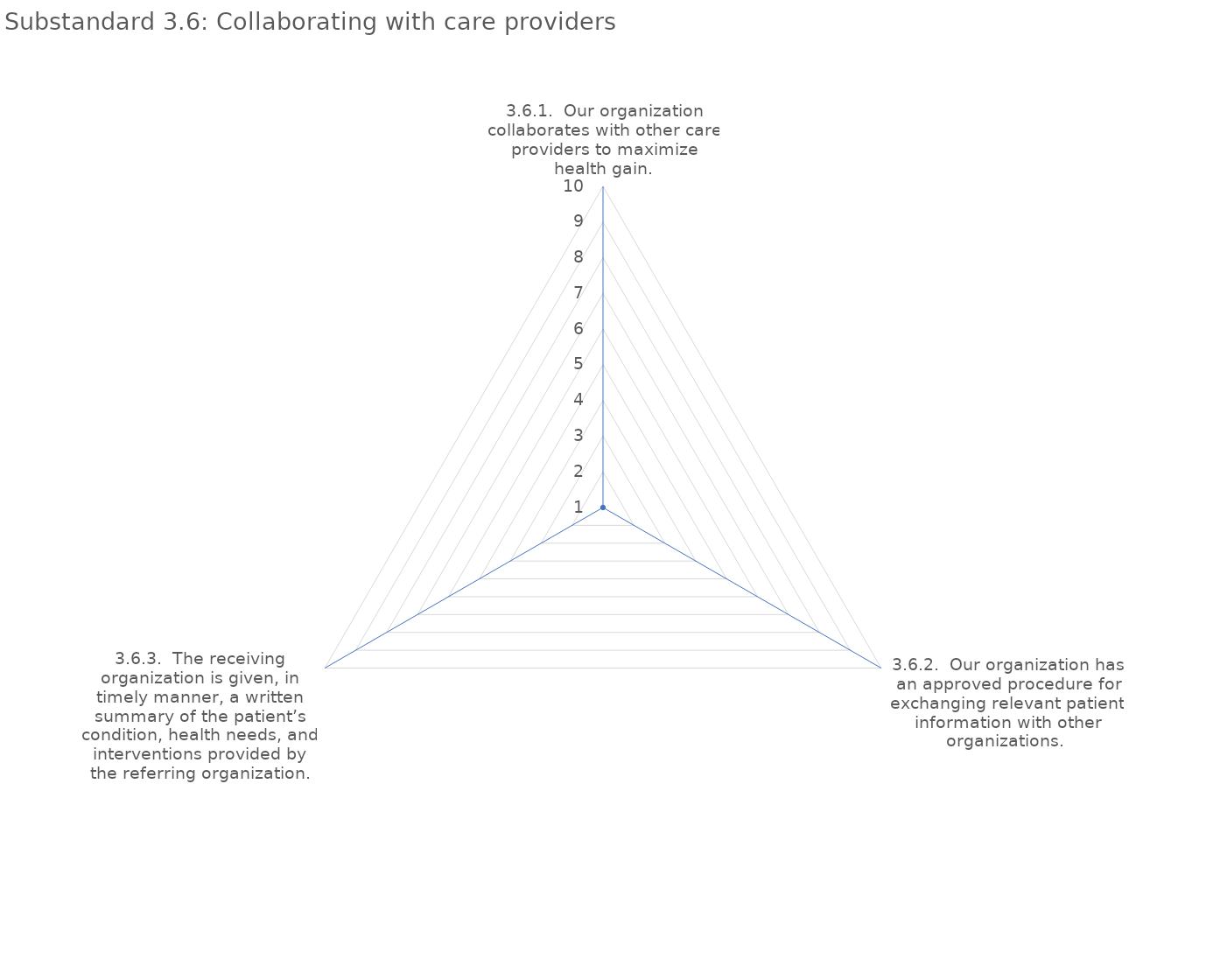
| Category | value |
|---|---|
| 3.6.1.  Our organization collaborates with other care providers to maximize health gain. | 1 |
| 3.6.2.  Our organization has an approved procedure for exchanging relevant patient information with other organizations.  | 1 |
| 3.6.3.  The receiving organization is given, in timely manner, a written summary of the patient’s condition, health needs, and interventions provided by the referring organization. | 1 |